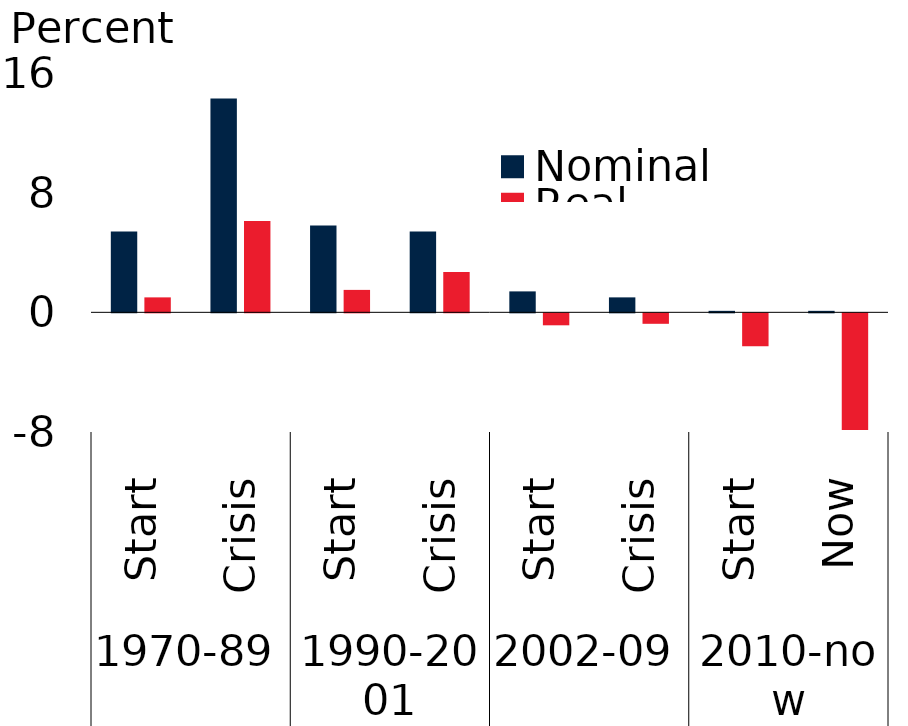
| Category | Nominal | Real |
|---|---|---|
| 0 | 5.4 | 1 |
| 1 | 14.3 | 6.1 |
| 2 | 5.8 | 1.5 |
| 3 | 5.4 | 2.7 |
| 4 | 1.4 | -0.8 |
| 5 | 1 | -0.7 |
| 6 | 0.1 | -2.2 |
| 7 | 0.1 | -7.8 |